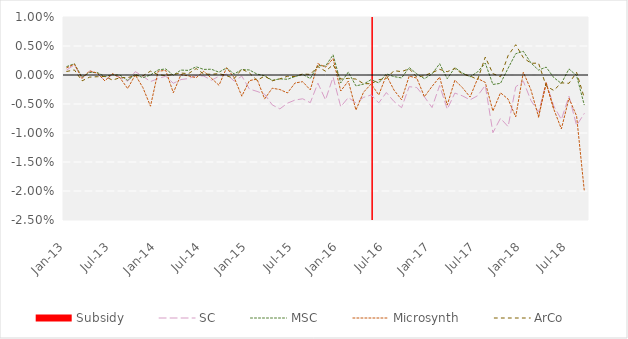
| Category | Subsidy |
|---|---|
| 0 | 0 |
| 1900-01-01 | 0 |
| 1900-01-02 | 0 |
| 1900-01-03 | 0 |
| 1900-01-04 | 0 |
| 1900-01-05 | 0 |
| 1900-01-06 | 0 |
| 1900-01-07 | 0 |
| 1900-01-08 | 0 |
| 1900-01-09 | 0 |
| 1900-01-10 | 0 |
| 1900-01-11 | 0 |
| 1900-01-12 | 0 |
| 1900-01-13 | 0 |
| 1900-01-14 | 0 |
| 1900-01-15 | 0 |
| 1900-01-16 | 0 |
| 1900-01-17 | 0 |
| 1900-01-18 | 0 |
| 1900-01-19 | 0 |
| 1900-01-20 | 0 |
| 1900-01-21 | 0 |
| 1900-01-22 | 0 |
| 1900-01-23 | 0 |
| 1900-01-24 | 0 |
| 1900-01-25 | 0 |
| 1900-01-26 | 0 |
| 1900-01-27 | 0 |
| 1900-01-28 | 0 |
| 1900-01-29 | 0 |
| 1900-01-30 | 0 |
| 1900-01-31 | 0 |
| 1900-02-01 | 0 |
| 1900-02-02 | 0 |
| 1900-02-03 | 0 |
| 1900-02-04 | 0 |
| 1900-02-05 | 0 |
| 1900-02-06 | 0 |
| 1900-02-07 | 0 |
| 1900-02-08 | 0 |
| 1900-02-09 | 1.5 |
| 1900-02-10 | 0 |
| 1900-02-11 | 0 |
| 1900-02-12 | 0 |
| 1900-02-13 | 0 |
| 1900-02-14 | 0 |
| 1900-02-15 | 0 |
| 1900-02-16 | 0 |
| 1900-02-17 | 0 |
| 1900-02-18 | 0 |
| 1900-02-19 | 0 |
| 1900-02-20 | 0 |
| 1900-02-21 | 0 |
| 1900-02-22 | 0 |
| 1900-02-23 | 0 |
| 1900-02-24 | 0 |
| 1900-02-25 | 0 |
| 1900-02-26 | 0 |
| 1900-02-27 | 0 |
| 1900-02-28 | 0 |
| 1900-02-28 | 0 |
| 1900-03-01 | 0 |
| 1900-03-02 | 0 |
| 1900-03-03 | 0 |
| 1900-03-04 | 0 |
| 1900-03-05 | 0 |
| 1900-03-06 | 0 |
| 1900-03-07 | 0 |
| 1900-03-08 | 0 |